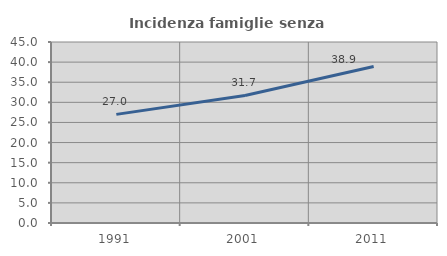
| Category | Incidenza famiglie senza nuclei |
|---|---|
| 1991.0 | 27.004 |
| 2001.0 | 31.716 |
| 2011.0 | 38.909 |